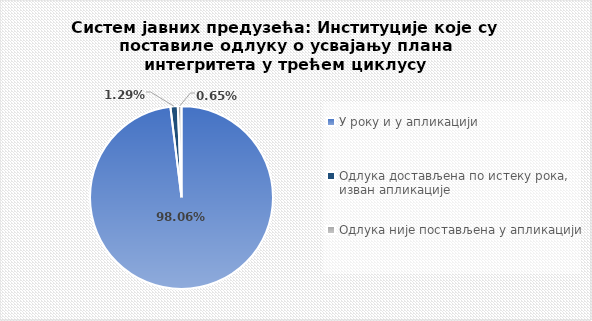
| Category | Series 0 |
|---|---|
| У року и у апликацији | 0.981 |
| Одлука достављена по истеку рока, изван апликације | 0.013 |
| Одлука није постављена у апликацији | 0.006 |